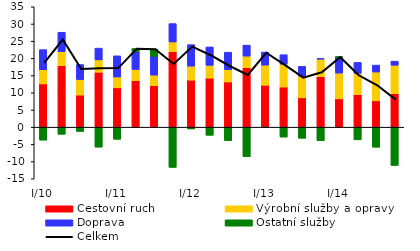
| Category | Cestovní ruch  | Výrobní služby a opravy | Doprava | Ostatní služby |
|---|---|---|---|---|
| I/10 | 12.584 | 4.096 | 5.865 | -3.762 |
| II | 17.873 | 4.096 | 5.628 | -2.057 |
| III | 9.331 | 4.524 | 4.354 | -1.24 |
| IV | 15.976 | 3.588 | 3.42 | -5.801 |
| I/11 | 11.431 | 3.156 | 6.162 | -3.509 |
| II | 13.528 | 3.236 | 5.236 | 0.875 |
| III | 12.037 | 3.104 | 5.449 | 2.149 |
| IV | 21.941 | 2.823 | 5.35 | -11.684 |
| I/12 | 13.692 | 4.048 | 6.252 | -0.513 |
| II | 14.269 | 3.724 | 5.341 | -2.361 |
| III | 13.14 | 3.585 | 5.083 | -3.885 |
| IV | 17.276 | 3.385 | 3.188 | -8.597 |
| I/13 | 12.195 | 5.852 | 3.788 | -0.133 |
| II | 11.675 | 6.652 | 2.738 | -2.878 |
| III | 8.529 | 6.323 | 2.82 | -3.214 |
| IV | 14.674 | 5.118 | 0.175 | -3.954 |
| I/14 | 8.232 | 7.495 | 4.681 | 0.01 |
| II | 9.456 | 6.213 | 3.163 | -3.68 |
| III | 7.658 | 8.378 | 2.02 | -5.821 |
| IV | 9.714 | 8.296 | 1.19 | -11.128 |